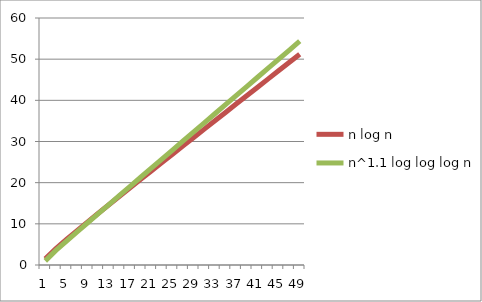
| Category | n log n | n^1.1 log log log n |
|---|---|---|
| 1.0 | 1.521 | 0.999 |
| 2.9999999999999996 | 3.999 | 3.538 |
| 5.0 | 6.22 | 5.805 |
| 7.0 | 8.366 | 8.039 |
| 8.999999999999998 | 10.476 | 10.26 |
| 11.0 | 12.563 | 12.476 |
| 12.999999999999998 | 14.635 | 14.688 |
| 14.999999999999998 | 16.697 | 16.897 |
| 17.0 | 18.752 | 19.105 |
| 19.0 | 20.8 | 21.312 |
| 20.999999999999996 | 22.844 | 23.517 |
| 22.999999999999996 | 24.883 | 25.722 |
| 25.0 | 26.919 | 27.927 |
| 26.999999999999996 | 28.953 | 30.131 |
| 28.999999999999993 | 30.984 | 32.335 |
| 30.999999999999996 | 33.013 | 34.538 |
| 32.99999999999999 | 35.04 | 36.741 |
| 35.0 | 37.065 | 38.944 |
| 37.0 | 39.09 | 41.146 |
| 38.99999999999999 | 41.112 | 43.349 |
| 41.0 | 43.134 | 45.551 |
| 43.0 | 45.155 | 47.753 |
| 44.99999999999999 | 47.175 | 49.955 |
| 47.0 | 49.193 | 52.157 |
| 48.99999999999999 | 51.212 | 54.359 |